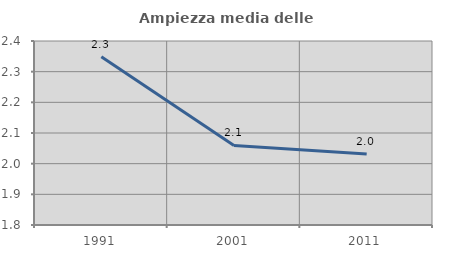
| Category | Ampiezza media delle famiglie |
|---|---|
| 1991.0 | 2.349 |
| 2001.0 | 2.059 |
| 2011.0 | 2.031 |